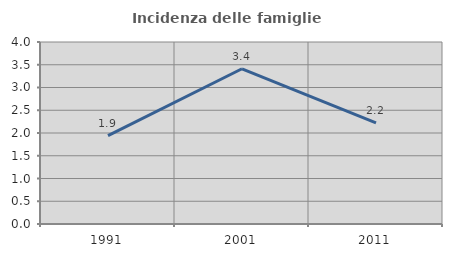
| Category | Incidenza delle famiglie numerose |
|---|---|
| 1991.0 | 1.943 |
| 2001.0 | 3.412 |
| 2011.0 | 2.222 |